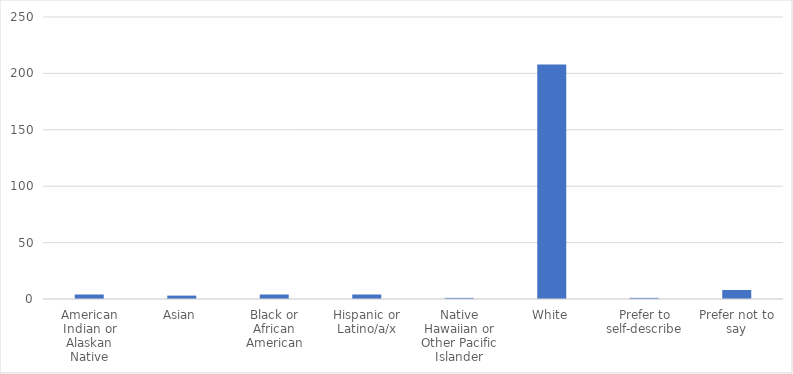
| Category | Number of Responses |
|---|---|
| American Indian or Alaskan Native | 4 |
| Asian | 3 |
| Black or African American | 4 |
| Hispanic or Latino/a/x | 4 |
| Native Hawaiian or Other Pacific Islander | 1 |
| White | 208 |
| Prefer to self-describe | 1 |
| Prefer not to say | 8 |